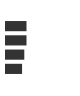
| Category | Series 0 |
|---|---|
| 0 | 0.289 |
| 1 | 0.289 |
| 2 | 0.258 |
| 3 | 0.226 |